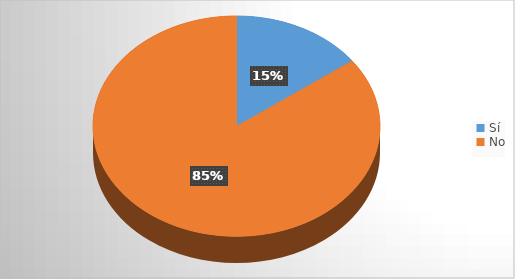
| Category | Series 0 |
|---|---|
| Sí | 11 |
| No | 63 |